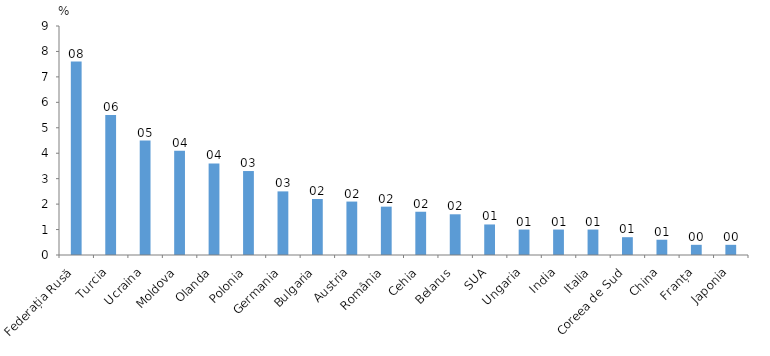
| Category | Series 0 |
|---|---|
| Federația Rusă | 7.6 |
| Turcia | 5.5 |
| Ucraina | 4.5 |
| Moldova | 4.1 |
| Olanda | 3.6 |
| Polonia | 3.3 |
| Germania | 2.5 |
| Bulgaria | 2.2 |
| Austria | 2.1 |
| România | 1.9 |
| Cehia | 1.7 |
| Belarus | 1.6 |
| SUA | 1.2 |
| Ungaria | 1 |
| India | 1 |
| Italia | 1 |
| Coreea de Sud | 0.7 |
| China | 0.6 |
| Franța | 0.4 |
| Japonia | 0.4 |